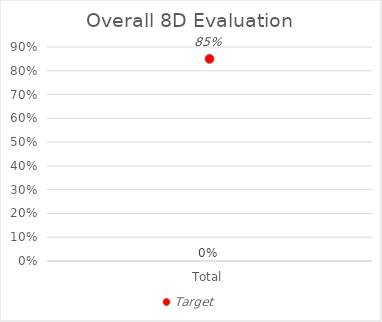
| Category | 8D Evaluation |
|---|---|
| Total | 0 |